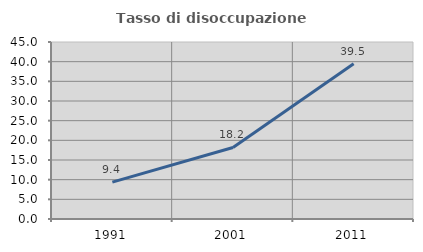
| Category | Tasso di disoccupazione giovanile  |
|---|---|
| 1991.0 | 9.375 |
| 2001.0 | 18.182 |
| 2011.0 | 39.474 |